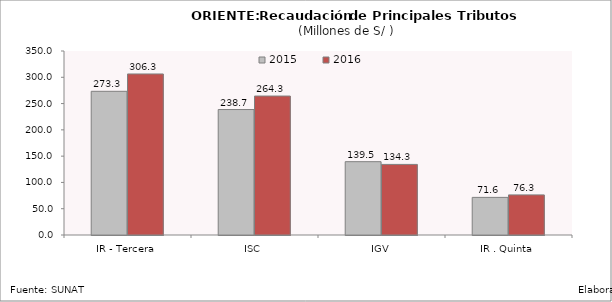
| Category | 2015 | 2016 |
|---|---|---|
| IR - Tercera | 273.323 | 306.319 |
| ISC | 238.657 | 264.334 |
| IGV | 139.457 | 134.271 |
| IR . Quinta | 71.555 | 76.312 |